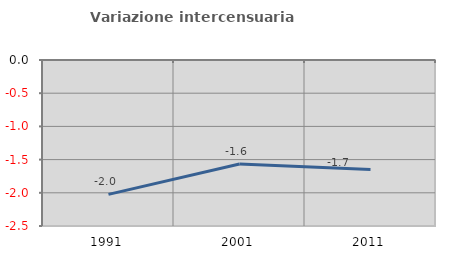
| Category | Variazione intercensuaria annua |
|---|---|
| 1991.0 | -2.023 |
| 2001.0 | -1.567 |
| 2011.0 | -1.65 |